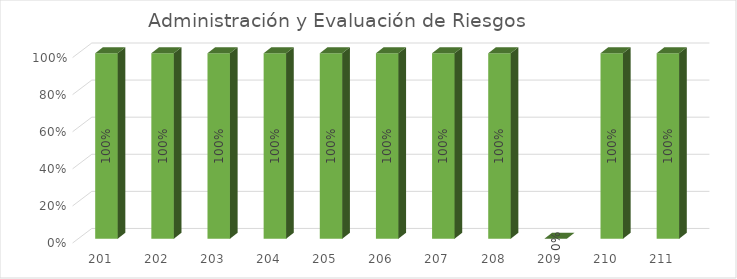
| Category | % Avance |
|---|---|
| 201.0 | 1 |
| 202.0 | 1 |
| 203.0 | 1 |
| 204.0 | 1 |
| 205.0 | 1 |
| 206.0 | 1 |
| 207.0 | 1 |
| 208.0 | 1 |
| 209.0 | 0 |
| 210.0 | 1 |
| 211.0 | 1 |